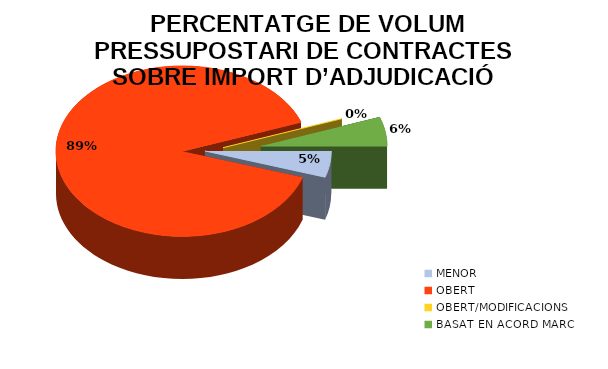
| Category |  PERCENTATGE DE VOLUM PRESSUPOSTARI DE CONTRACTES MITJANÇANT ELS PROCEDIMENTS D’ADJUDICACIÓ |
|---|---|
| MENOR | 0.05 |
| OBERT | 0.895 |
| OBERT/MODIFICACIONS | 0 |
| BASAT EN ACORD MARC | 0.055 |